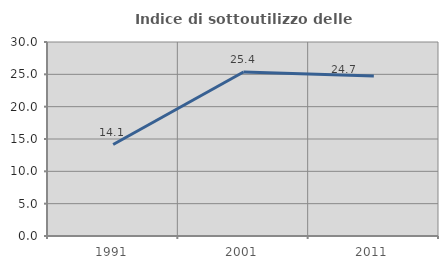
| Category | Indice di sottoutilizzo delle abitazioni  |
|---|---|
| 1991.0 | 14.144 |
| 2001.0 | 25.371 |
| 2011.0 | 24.731 |